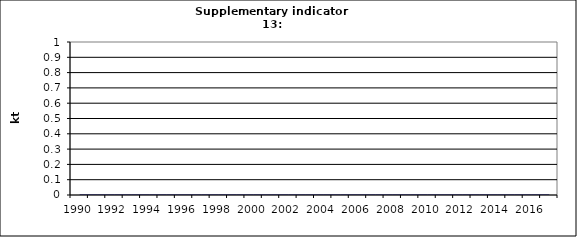
| Category | Physical output of paper, kt |
|---|---|
| 1990 | 0 |
| 1991 | 0 |
| 1992 | 0 |
| 1993 | 0 |
| 1994 | 0 |
| 1995 | 0 |
| 1996 | 0 |
| 1997 | 0 |
| 1998 | 0 |
| 1999 | 0 |
| 2000 | 0 |
| 2001 | 0 |
| 2002 | 0 |
| 2003 | 0 |
| 2004 | 0 |
| 2005 | 0 |
| 2006 | 0 |
| 2007 | 0 |
| 2008 | 0 |
| 2009 | 0 |
| 2010 | 0 |
| 2011 | 0 |
| 2012 | 0 |
| 2013 | 0 |
| 2014 | 0 |
| 2015 | 0 |
| 2016 | 0 |
| 2017 | 0 |